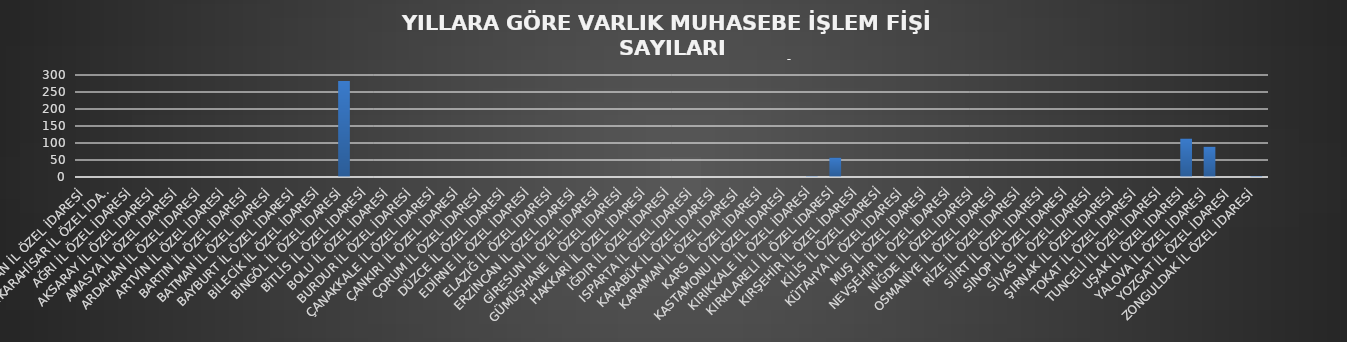
| Category | Series 0 |
|---|---|
| ADIYAMAN İL ÖZEL İDARESİ | 0 |
| AFYONKARAHİSAR İL ÖZEL İDARESİ | 0 |
| AĞRI İL ÖZEL İDARESİ | 0 |
| AKSARAY İL ÖZEL İDARESİ | 0 |
| AMASYA İL ÖZEL İDARESİ | 0 |
| ARDAHAN İL ÖZEL İDARESİ | 0 |
| ARTVİN İL ÖZEL İDARESİ | 0 |
| BARTIN İL ÖZEL İDARESİ | 0 |
| BATMAN İL ÖZEL İDARESİ | 0 |
| BAYBURT İL ÖZEL İDARESİ | 0 |
| BİLECİK İL ÖZEL İDARESİ | 0 |
| BİNGÖL İL ÖZEL İDARESİ | 282 |
| BİTLİS İL ÖZEL İDARESİ | 0 |
| BOLU İL ÖZEL İDARESİ | 0 |
| BURDUR İL ÖZEL İDARESİ | 0 |
| ÇANAKKALE İL ÖZEL İDARESİ | 0 |
| ÇANKIRI İL ÖZEL İDARESİ | 0 |
| ÇORUM İL ÖZEL İDARESİ | 0 |
| DÜZCE İL ÖZEL İDARESİ | 0 |
| EDİRNE İL ÖZEL İDARESİ | 0 |
| ELAZIĞ İL ÖZEL İDARESİ | 0 |
| ERZİNCAN İL ÖZEL İDARESİ | 0 |
| GİRESUN İL ÖZEL İDARESİ | 0 |
| GÜMÜŞHANE İL ÖZEL İDARESİ | 0 |
| HAKKARİ İL ÖZEL İDARESİ | 0 |
| IĞDIR İL ÖZEL İDARESİ | 0 |
| ISPARTA İL ÖZEL İDARESİ | 0 |
| KARABÜK İL ÖZEL İDARESİ | 0 |
| KARAMAN İL ÖZEL İDARESİ | 0 |
| KARS İL ÖZEL İDARESİ | 0 |
| KASTAMONU İL ÖZEL İDARESİ | 0 |
| KIRIKKALE İL ÖZEL İDARESİ | 2 |
| KIRKLARELİ İL ÖZEL İDARESİ | 57 |
| KIRŞEHİR İL ÖZEL İDARESİ | 0 |
| KİLİS İL ÖZEL İDARESİ | 0 |
| KÜTAHYA İL ÖZEL İDARESİ | 0 |
| MUŞ İL ÖZEL İDARESİ | 0 |
| NEVŞEHİR İL ÖZEL İDARESİ | 0 |
| NİĞDE İL ÖZEL İDARESİ | 0 |
| OSMANİYE İL ÖZEL İDARESİ | 0 |
| RİZE İL ÖZEL İDARESİ | 0 |
| SİİRT İL ÖZEL İDARESİ | 0 |
| SİNOP İL ÖZEL İDARESİ | 0 |
| SİVAS İL ÖZEL İDARESİ | 0 |
| ŞIRNAK İL ÖZEL İDARESİ | 0 |
| TOKAT İL ÖZEL İDARESİ | 0 |
| TUNCELİ İL ÖZEL İDARESİ | 0 |
| UŞAK İL ÖZEL İDARESİ | 113 |
| YALOVA İL ÖZEL İDARESİ | 89 |
| YOZGAT İL ÖZEL İDARESİ | 0 |
| ZONGULDAK İL ÖZEL İDARESİ | 3 |